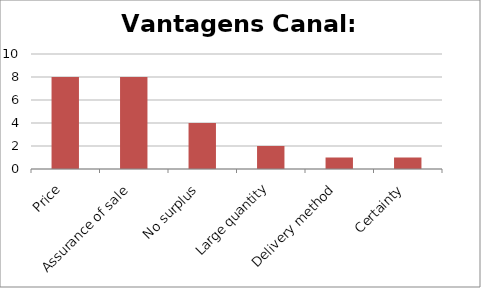
| Category | Series 0 |
|---|---|
| Price | 8 |
| Assurance of sale | 8 |
| No surplus | 4 |
| Large quantity | 2 |
| Delivery method | 1 |
| Certainty | 1 |